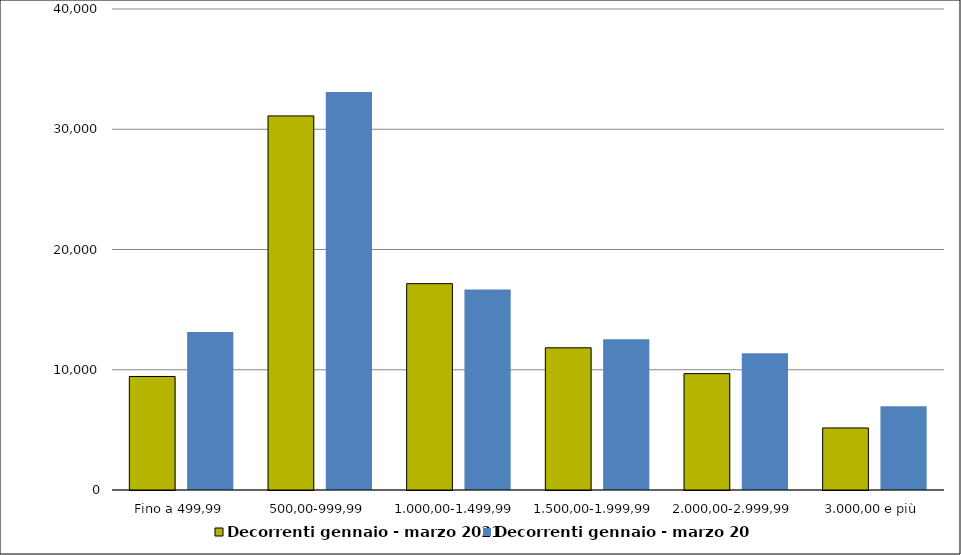
| Category | Decorrenti gennaio - marzo 2021 | Decorrenti gennaio - marzo 2020 |
|---|---|---|
|  Fino a 499,99  | 9441 | 13139 |
|  500,00-999,99  | 31109 | 33090 |
|  1.000,00-1.499,99  | 17159 | 16664 |
|  1.500,00-1.999,99  | 11825 | 12526 |
|  2.000,00-2.999,99  | 9678 | 11368 |
|  3.000,00 e più  | 5159 | 6971 |